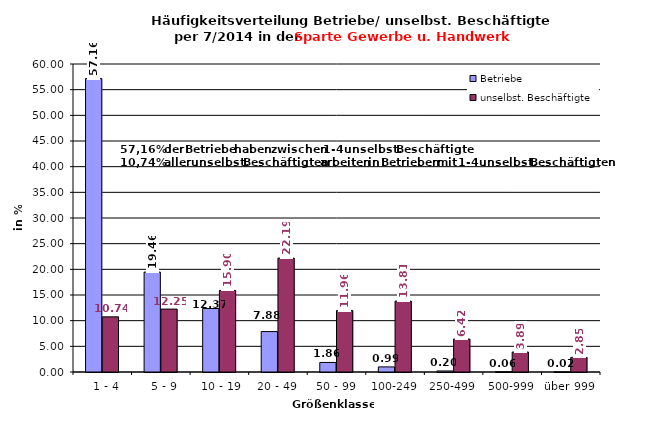
| Category | Betriebe | unselbst. Beschäftigte |
|---|---|---|
|   1 - 4 | 57.158 | 10.739 |
|   5 - 9 | 19.464 | 12.251 |
|  10 - 19 | 12.366 | 15.897 |
| 20 - 49 | 7.875 | 22.186 |
| 50 - 99 | 1.86 | 11.962 |
| 100-249 | 0.994 | 13.809 |
| 250-499 | 0.202 | 6.418 |
| 500-999 | 0.06 | 3.893 |
| über 999 | 0.022 | 2.846 |